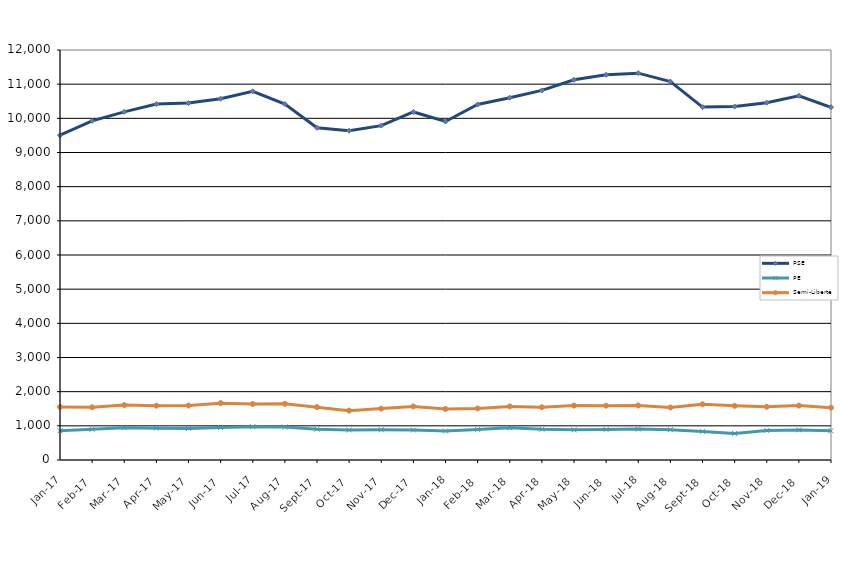
| Category | PSE | PE | Semi-Liberté |
|---|---|---|---|
| 2017-01-01 | 9505 | 855 | 1553 |
| 2017-02-01 | 9927 | 900 | 1542 |
| 2017-03-01 | 10190 | 942 | 1607 |
| 2017-04-01 | 10417 | 931 | 1590 |
| 2017-05-01 | 10448 | 924 | 1594 |
| 2017-06-01 | 10575 | 951 | 1664 |
| 2017-07-01 | 10791 | 974 | 1639 |
| 2017-08-01 | 10417 | 963 | 1644 |
| 2017-09-01 | 9723 | 903 | 1547 |
| 2017-10-01 | 9637 | 879 | 1445 |
| 2017-11-01 | 9787 | 885 | 1504 |
| 2017-12-01 | 10187 | 876 | 1568 |
| 2018-01-01 | 9907 | 847 | 1493 |
| 2018-02-01 | 10406 | 895 | 1508 |
| 2018-03-01 | 10603 | 942 | 1569 |
| 2018-04-01 | 10817 | 901 | 1544 |
| 2018-05-01 | 11127 | 882 | 1594 |
| 2018-06-01 | 11275 | 890 | 1591 |
| 2018-07-01 | 11322 | 905 | 1596 |
| 2018-08-01 | 11075 | 888 | 1537 |
| 2018-09-01 | 10329 | 837 | 1630 |
| 2018-10-01 | 10344 | 776 | 1587 |
| 2018-11-01 | 10458 | 863 | 1557 |
| 2018-12-01 | 10661 | 880 | 1593 |
| 2019-01-01 | 10325 | 856 | 1530 |